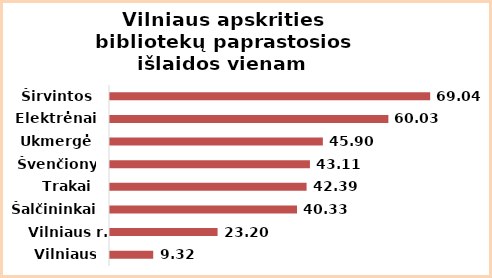
| Category | Series 0 |
|---|---|
| Vilniaus m. | 9.32 |
| Vilniaus r. | 23.2 |
| Šalčininkai | 40.33 |
| Trakai | 42.39 |
| Švenčionys | 43.11 |
| Ukmergė | 45.9 |
| Elektrėnai | 60.03 |
| Širvintos | 69.04 |